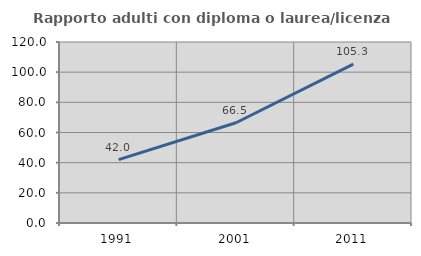
| Category | Rapporto adulti con diploma o laurea/licenza media  |
|---|---|
| 1991.0 | 42.029 |
| 2001.0 | 66.458 |
| 2011.0 | 105.336 |